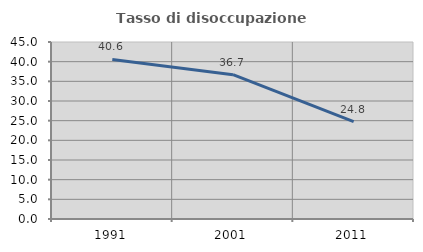
| Category | Tasso di disoccupazione giovanile  |
|---|---|
| 1991.0 | 40.566 |
| 2001.0 | 36.691 |
| 2011.0 | 24.752 |